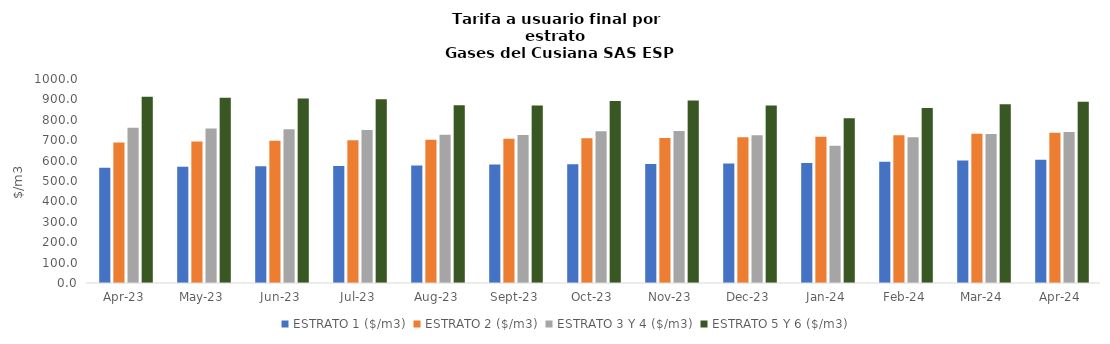
| Category | ESTRATO 1 ($/m3) | ESTRATO 2 ($/m3) | ESTRATO 3 Y 4 ($/m3) | ESTRATO 5 Y 6 ($/m3) |
|---|---|---|---|---|
| 2023-04-01 | 565.3 | 689.03 | 760.69 | 912.828 |
| 2023-05-01 | 569.53 | 694.19 | 757.13 | 908.556 |
| 2023-06-01 | 571.88 | 697.06 | 753.75 | 904.5 |
| 2023-07-01 | 573.63 | 699.2 | 750.21 | 900.252 |
| 2023-08-01 | 576.45 | 702.64 | 726.44 | 871.728 |
| 2023-09-01 | 580.51 | 707.59 | 725.31 | 870.372 |
| 2023-10-01 | 581.75 | 709.1 | 743.81 | 892.572 |
| 2023-11-01 | 583.2 | 710.87 | 745.28 | 894.336 |
| 2023-12-01 | 585.94 | 714.2 | 724.84 | 869.808 |
| 2024-01-01 | 588.63 | 717.48 | 672.77 | 807.324 |
| 2024-02-01 | 594.02 | 724.04 | 714.4 | 857.28 |
| 2024-03-01 | 600.47 | 731.91 | 730.01 | 876.012 |
| 2024-04-01 | 604.7 | 737.07 | 740.02 | 888.024 |